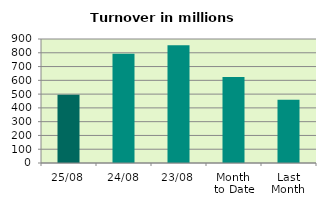
| Category | Series 0 |
|---|---|
| 25/08 | 495.869 |
| 24/08 | 793.271 |
| 23/08 | 854.048 |
| Month 
to Date | 623.413 |
| Last
Month | 458.733 |